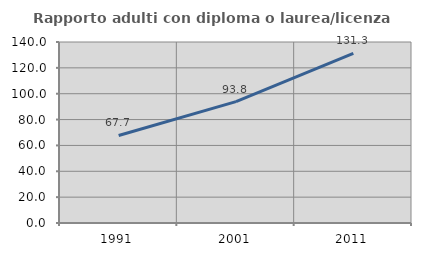
| Category | Rapporto adulti con diploma o laurea/licenza media  |
|---|---|
| 1991.0 | 67.699 |
| 2001.0 | 93.846 |
| 2011.0 | 131.25 |